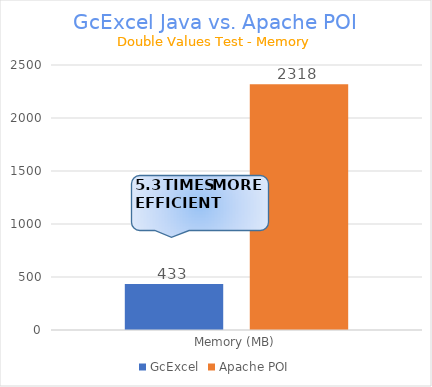
| Category | GcExcel | Apache POI |
|---|---|---|
| Memory (MB) | 433.372 | 2317.904 |